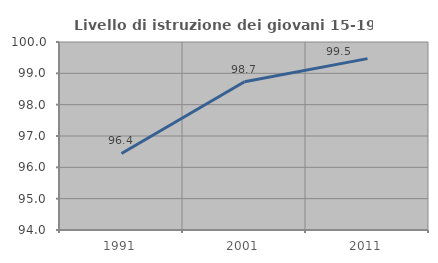
| Category | Livello di istruzione dei giovani 15-19 anni |
|---|---|
| 1991.0 | 96.442 |
| 2001.0 | 98.73 |
| 2011.0 | 99.469 |